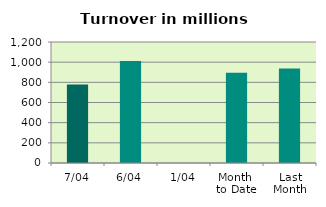
| Category | Series 0 |
|---|---|
| 7/04 | 779.188 |
| 6/04 | 1011.662 |
| 1/04 | 0 |
| Month 
to Date | 895.425 |
| Last
Month | 937.305 |